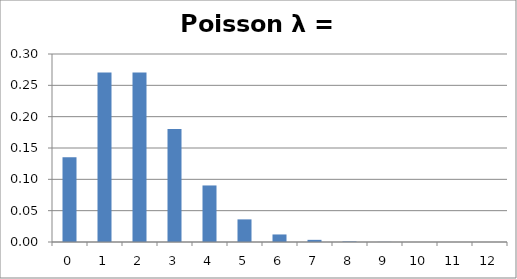
| Category | Series 0 |
|---|---|
| 0.0 | 0.135 |
| 1.0 | 0.271 |
| 2.0 | 0.271 |
| 3.0 | 0.18 |
| 4.0 | 0.09 |
| 5.0 | 0.036 |
| 6.0 | 0.012 |
| 7.0 | 0.003 |
| 8.0 | 0.001 |
| 9.0 | 0 |
| 10.0 | 0 |
| 11.0 | 0 |
| 12.0 | 0 |